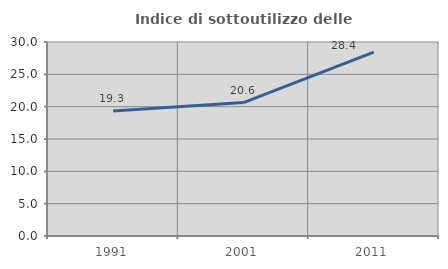
| Category | Indice di sottoutilizzo delle abitazioni  |
|---|---|
| 1991.0 | 19.323 |
| 2001.0 | 20.64 |
| 2011.0 | 28.449 |